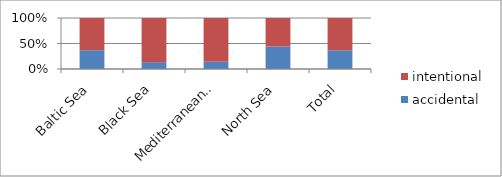
| Category | accidental | intentional |
|---|---|---|
| Baltic Sea | 33172.75 | 56730.5 |
| Black Sea | 3225.5 | 20937.75 |
| Mediterranean Sea | 15870 | 97038.75 |
| North Sea | 185947 | 236046.75 |
| Total | 238215.25 | 410753.75 |